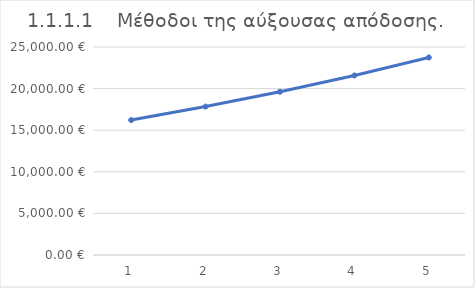
| Category | 1.1.1.1    Μέθοδοι της αύξουσας απόδοσης.  |
|---|---|
| 1.0 | 16215.951 |
| 2.0 | 17837.546 |
| 3.0 | 19621.3 |
| 4.0 | 21583.43 |
| 5.0 | 23741.773 |